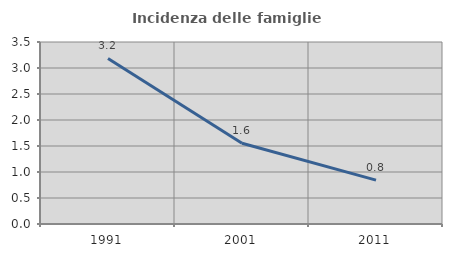
| Category | Incidenza delle famiglie numerose |
|---|---|
| 1991.0 | 3.184 |
| 2001.0 | 1.553 |
| 2011.0 | 0.843 |